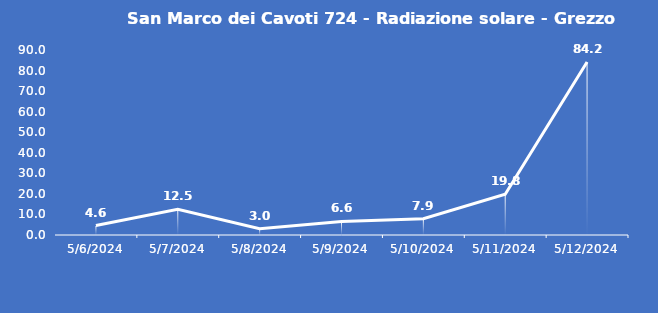
| Category | San Marco dei Cavoti 724 - Radiazione solare - Grezzo (W/m2) |
|---|---|
| 5/6/24 | 4.6 |
| 5/7/24 | 12.5 |
| 5/8/24 | 3 |
| 5/9/24 | 6.6 |
| 5/10/24 | 7.9 |
| 5/11/24 | 19.8 |
| 5/12/24 | 84.2 |